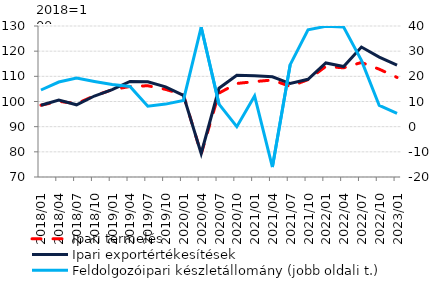
| Category | Ipari termelés | Ipari exportértékesítések |
|---|---|---|
| 2018-01-01 | 98.518 | 98.524 |
| 2018-04-01 | 100.074 | 100.613 |
| 2018-07-01 | 99.147 | 98.686 |
| 2018-10-01 | 102.262 | 102.176 |
| 2019-01-01 | 104.669 | 104.683 |
| 2019-04-01 | 105.986 | 107.979 |
| 2019-07-01 | 106.256 | 107.823 |
| 2019-10-01 | 104.814 | 105.846 |
| 2020-01-01 | 102.691 | 102.412 |
| 2020-04-01 | 79.173 | 79.338 |
| 2020-07-01 | 103.345 | 105.266 |
| 2020-10-01 | 107.164 | 110.459 |
| 2021-01-01 | 107.909 | 110.198 |
| 2021-04-01 | 108.543 | 109.838 |
| 2021-07-01 | 105.985 | 107.141 |
| 2021-10-01 | 108.69 | 108.831 |
| 2022-01-01 | 113.928 | 115.322 |
| 2022-04-01 | 113.378 | 113.904 |
| 2022-07-01 | 115.511 | 121.64 |
| 2022-10-01 | 112.84 | 117.648 |
| 2023-01-01 | 109.577 | 114.5 |